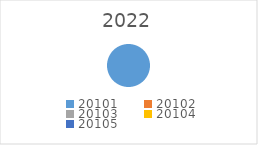
| Category | Series 0 |
|---|---|
| 20101.0 | 330000 |
| 20102.0 | 0 |
| 20103.0 | 0 |
| 20104.0 | 0 |
| 20105.0 | 0 |